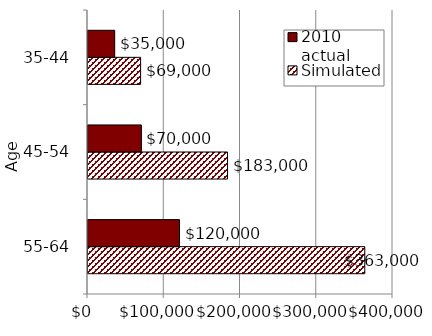
| Category | Simulated | 2010 actual |
|---|---|---|
| 55-64 | 363000 | 120000 |
| 45-54 | 183000 | 70000 |
| 35-44 | 69000 | 35000 |